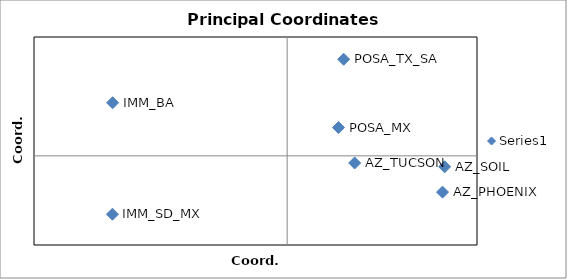
| Category | Series 0 |
|---|---|
| 0.4910764242808443 | -0.061 |
| 0.4977217309624026 | -0.018 |
| 0.21343055427367144 | -0.012 |
| -0.551552400910419 | 0.089 |
| -0.5520646854489263 | -0.098 |
| 0.16230704596056494 | 0.048 |
| 0.17862369301887757 | 0.163 |